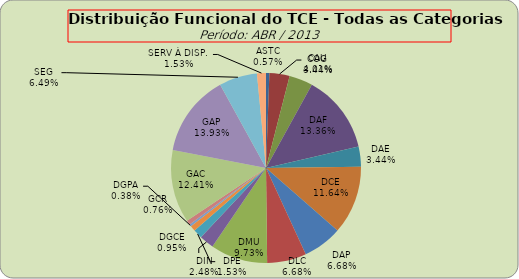
| Category | ASTC COG CAU DAF DAE DCE DAP DLC DMU DIN DPE DGCE DGPA GCR GAC GAP SEG SERV À DISP. |
|---|---|
| ASTC | 3 |
| COG | 18 |
| CAU | 21 |
| DAF | 70 |
| DAE | 18 |
| DCE | 61 |
| DAP | 35 |
| DLC | 35 |
| DMU | 51 |
| DIN | 13 |
| DPE | 8 |
| DGCE | 5 |
| DGPA | 2 |
| GCR | 4 |
| GAC | 65 |
| GAP | 73 |
| SEG | 34 |
| SERV À DISP. | 8 |